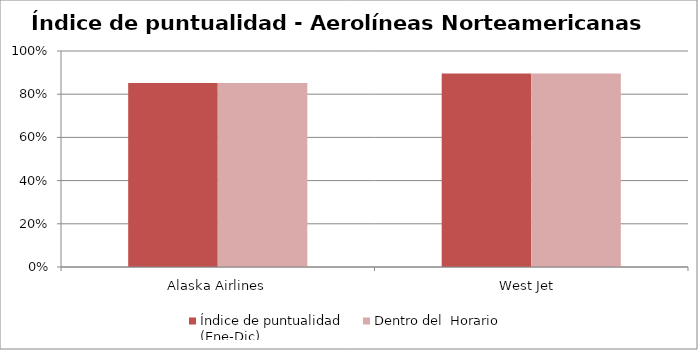
| Category | Índice de puntualidad
(Ene-Dic) | Dentro del  Horario |
|---|---|---|
| Alaska Airlines | 0.852 | 0.852 |
| West Jet  | 0.896 | 0.896 |